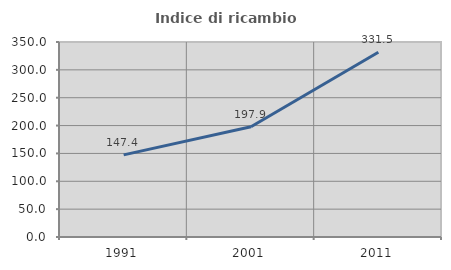
| Category | Indice di ricambio occupazionale  |
|---|---|
| 1991.0 | 147.393 |
| 2001.0 | 197.927 |
| 2011.0 | 331.507 |